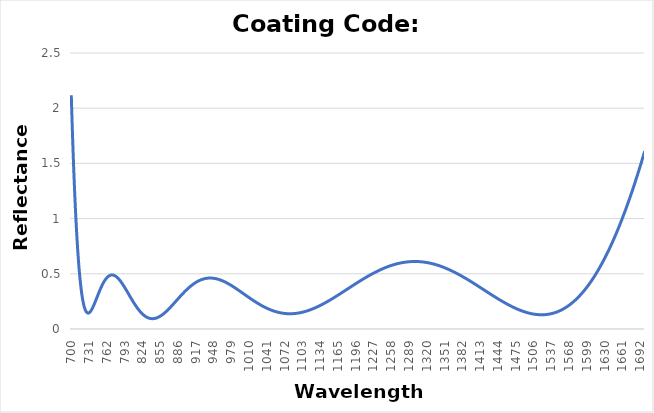
| Category | Reflectance |
|---|---|
| 700.0 | 2.118 |
| 701.0 | 1.944 |
| 702.0 | 1.78 |
| 703.0 | 1.627 |
| 704.0 | 1.484 |
| 705.0 | 1.351 |
| 706.0 | 1.227 |
| 707.0 | 1.111 |
| 708.0 | 1.004 |
| 709.0 | 0.906 |
| 710.0 | 0.815 |
| 711.0 | 0.732 |
| 712.0 | 0.656 |
| 713.0 | 0.586 |
| 714.0 | 0.523 |
| 715.0 | 0.466 |
| 716.0 | 0.415 |
| 717.0 | 0.37 |
| 718.0 | 0.329 |
| 719.0 | 0.293 |
| 720.0 | 0.262 |
| 721.0 | 0.236 |
| 722.0 | 0.213 |
| 723.0 | 0.194 |
| 724.0 | 0.178 |
| 725.0 | 0.166 |
| 726.0 | 0.156 |
| 727.0 | 0.15 |
| 728.0 | 0.146 |
| 729.0 | 0.144 |
| 730.0 | 0.144 |
| 731.0 | 0.146 |
| 732.0 | 0.15 |
| 733.0 | 0.156 |
| 734.0 | 0.162 |
| 735.0 | 0.171 |
| 736.0 | 0.18 |
| 737.0 | 0.19 |
| 738.0 | 0.201 |
| 739.0 | 0.212 |
| 740.0 | 0.224 |
| 741.0 | 0.237 |
| 742.0 | 0.25 |
| 743.0 | 0.263 |
| 744.0 | 0.276 |
| 745.0 | 0.289 |
| 746.0 | 0.302 |
| 747.0 | 0.315 |
| 748.0 | 0.328 |
| 749.0 | 0.341 |
| 750.0 | 0.353 |
| 751.0 | 0.365 |
| 752.0 | 0.377 |
| 753.0 | 0.388 |
| 754.0 | 0.399 |
| 755.0 | 0.409 |
| 756.0 | 0.419 |
| 757.0 | 0.428 |
| 758.0 | 0.436 |
| 759.0 | 0.444 |
| 760.0 | 0.451 |
| 761.0 | 0.458 |
| 762.0 | 0.464 |
| 763.0 | 0.469 |
| 764.0 | 0.474 |
| 765.0 | 0.478 |
| 766.0 | 0.482 |
| 767.0 | 0.484 |
| 768.0 | 0.487 |
| 769.0 | 0.488 |
| 770.0 | 0.489 |
| 771.0 | 0.489 |
| 772.0 | 0.489 |
| 773.0 | 0.488 |
| 774.0 | 0.487 |
| 775.0 | 0.485 |
| 776.0 | 0.482 |
| 777.0 | 0.479 |
| 778.0 | 0.476 |
| 779.0 | 0.472 |
| 780.0 | 0.467 |
| 781.0 | 0.462 |
| 782.0 | 0.457 |
| 783.0 | 0.451 |
| 784.0 | 0.445 |
| 785.0 | 0.439 |
| 786.0 | 0.432 |
| 787.0 | 0.425 |
| 788.0 | 0.418 |
| 789.0 | 0.41 |
| 790.0 | 0.402 |
| 791.0 | 0.394 |
| 792.0 | 0.386 |
| 793.0 | 0.378 |
| 794.0 | 0.369 |
| 795.0 | 0.36 |
| 796.0 | 0.352 |
| 797.0 | 0.343 |
| 798.0 | 0.334 |
| 799.0 | 0.325 |
| 800.0 | 0.316 |
| 801.0 | 0.307 |
| 802.0 | 0.298 |
| 803.0 | 0.29 |
| 804.0 | 0.281 |
| 805.0 | 0.272 |
| 806.0 | 0.263 |
| 807.0 | 0.255 |
| 808.0 | 0.246 |
| 809.0 | 0.238 |
| 810.0 | 0.23 |
| 811.0 | 0.222 |
| 812.0 | 0.214 |
| 813.0 | 0.206 |
| 814.0 | 0.199 |
| 815.0 | 0.192 |
| 816.0 | 0.184 |
| 817.0 | 0.178 |
| 818.0 | 0.171 |
| 819.0 | 0.165 |
| 820.0 | 0.158 |
| 821.0 | 0.153 |
| 822.0 | 0.147 |
| 823.0 | 0.142 |
| 824.0 | 0.137 |
| 825.0 | 0.132 |
| 826.0 | 0.127 |
| 827.0 | 0.123 |
| 828.0 | 0.119 |
| 829.0 | 0.115 |
| 830.0 | 0.112 |
| 831.0 | 0.109 |
| 832.0 | 0.106 |
| 833.0 | 0.104 |
| 834.0 | 0.101 |
| 835.0 | 0.099 |
| 836.0 | 0.098 |
| 837.0 | 0.096 |
| 838.0 | 0.095 |
| 839.0 | 0.094 |
| 840.0 | 0.094 |
| 841.0 | 0.094 |
| 842.0 | 0.094 |
| 843.0 | 0.094 |
| 844.0 | 0.094 |
| 845.0 | 0.095 |
| 846.0 | 0.096 |
| 847.0 | 0.097 |
| 848.0 | 0.099 |
| 849.0 | 0.101 |
| 850.0 | 0.103 |
| 851.0 | 0.105 |
| 852.0 | 0.107 |
| 853.0 | 0.11 |
| 854.0 | 0.113 |
| 855.0 | 0.116 |
| 856.0 | 0.119 |
| 857.0 | 0.123 |
| 858.0 | 0.126 |
| 859.0 | 0.13 |
| 860.0 | 0.134 |
| 861.0 | 0.138 |
| 862.0 | 0.142 |
| 863.0 | 0.147 |
| 864.0 | 0.152 |
| 865.0 | 0.156 |
| 866.0 | 0.161 |
| 867.0 | 0.166 |
| 868.0 | 0.171 |
| 869.0 | 0.176 |
| 870.0 | 0.181 |
| 871.0 | 0.187 |
| 872.0 | 0.192 |
| 873.0 | 0.198 |
| 874.0 | 0.203 |
| 875.0 | 0.209 |
| 876.0 | 0.214 |
| 877.0 | 0.22 |
| 878.0 | 0.226 |
| 879.0 | 0.232 |
| 880.0 | 0.237 |
| 881.0 | 0.243 |
| 882.0 | 0.249 |
| 883.0 | 0.255 |
| 884.0 | 0.261 |
| 885.0 | 0.267 |
| 886.0 | 0.272 |
| 887.0 | 0.278 |
| 888.0 | 0.284 |
| 889.0 | 0.29 |
| 890.0 | 0.295 |
| 891.0 | 0.301 |
| 892.0 | 0.307 |
| 893.0 | 0.312 |
| 894.0 | 0.318 |
| 895.0 | 0.323 |
| 896.0 | 0.329 |
| 897.0 | 0.334 |
| 898.0 | 0.339 |
| 899.0 | 0.344 |
| 900.0 | 0.35 |
| 901.0 | 0.355 |
| 902.0 | 0.36 |
| 903.0 | 0.364 |
| 904.0 | 0.369 |
| 905.0 | 0.374 |
| 906.0 | 0.378 |
| 907.0 | 0.383 |
| 908.0 | 0.387 |
| 909.0 | 0.391 |
| 910.0 | 0.396 |
| 911.0 | 0.4 |
| 912.0 | 0.403 |
| 913.0 | 0.407 |
| 914.0 | 0.411 |
| 915.0 | 0.414 |
| 916.0 | 0.418 |
| 917.0 | 0.421 |
| 918.0 | 0.424 |
| 919.0 | 0.427 |
| 920.0 | 0.43 |
| 921.0 | 0.433 |
| 922.0 | 0.436 |
| 923.0 | 0.438 |
| 924.0 | 0.44 |
| 925.0 | 0.443 |
| 926.0 | 0.445 |
| 927.0 | 0.447 |
| 928.0 | 0.449 |
| 929.0 | 0.451 |
| 930.0 | 0.452 |
| 931.0 | 0.454 |
| 932.0 | 0.455 |
| 933.0 | 0.456 |
| 934.0 | 0.457 |
| 935.0 | 0.458 |
| 936.0 | 0.459 |
| 937.0 | 0.46 |
| 938.0 | 0.46 |
| 939.0 | 0.461 |
| 940.0 | 0.461 |
| 941.0 | 0.461 |
| 942.0 | 0.462 |
| 943.0 | 0.462 |
| 944.0 | 0.461 |
| 945.0 | 0.461 |
| 946.0 | 0.461 |
| 947.0 | 0.46 |
| 948.0 | 0.46 |
| 949.0 | 0.459 |
| 950.0 | 0.458 |
| 951.0 | 0.457 |
| 952.0 | 0.456 |
| 953.0 | 0.455 |
| 954.0 | 0.454 |
| 955.0 | 0.452 |
| 956.0 | 0.451 |
| 957.0 | 0.449 |
| 958.0 | 0.448 |
| 959.0 | 0.446 |
| 960.0 | 0.444 |
| 961.0 | 0.442 |
| 962.0 | 0.44 |
| 963.0 | 0.438 |
| 964.0 | 0.436 |
| 965.0 | 0.433 |
| 966.0 | 0.431 |
| 967.0 | 0.429 |
| 968.0 | 0.426 |
| 969.0 | 0.424 |
| 970.0 | 0.421 |
| 971.0 | 0.418 |
| 972.0 | 0.415 |
| 973.0 | 0.413 |
| 974.0 | 0.41 |
| 975.0 | 0.407 |
| 976.0 | 0.404 |
| 977.0 | 0.401 |
| 978.0 | 0.398 |
| 979.0 | 0.394 |
| 980.0 | 0.391 |
| 981.0 | 0.388 |
| 982.0 | 0.385 |
| 983.0 | 0.381 |
| 984.0 | 0.378 |
| 985.0 | 0.375 |
| 986.0 | 0.371 |
| 987.0 | 0.368 |
| 988.0 | 0.364 |
| 989.0 | 0.361 |
| 990.0 | 0.357 |
| 991.0 | 0.354 |
| 992.0 | 0.35 |
| 993.0 | 0.346 |
| 994.0 | 0.343 |
| 995.0 | 0.339 |
| 996.0 | 0.336 |
| 997.0 | 0.332 |
| 998.0 | 0.328 |
| 999.0 | 0.325 |
| 1000.0 | 0.321 |
| 1001.0 | 0.317 |
| 1002.0 | 0.314 |
| 1003.0 | 0.31 |
| 1004.0 | 0.306 |
| 1005.0 | 0.303 |
| 1006.0 | 0.299 |
| 1007.0 | 0.295 |
| 1008.0 | 0.292 |
| 1009.0 | 0.288 |
| 1010.0 | 0.284 |
| 1011.0 | 0.281 |
| 1012.0 | 0.277 |
| 1013.0 | 0.274 |
| 1014.0 | 0.27 |
| 1015.0 | 0.267 |
| 1016.0 | 0.263 |
| 1017.0 | 0.26 |
| 1018.0 | 0.256 |
| 1019.0 | 0.253 |
| 1020.0 | 0.25 |
| 1021.0 | 0.246 |
| 1022.0 | 0.243 |
| 1023.0 | 0.24 |
| 1024.0 | 0.237 |
| 1025.0 | 0.233 |
| 1026.0 | 0.23 |
| 1027.0 | 0.227 |
| 1028.0 | 0.224 |
| 1029.0 | 0.221 |
| 1030.0 | 0.218 |
| 1031.0 | 0.215 |
| 1032.0 | 0.212 |
| 1033.0 | 0.209 |
| 1034.0 | 0.206 |
| 1035.0 | 0.204 |
| 1036.0 | 0.201 |
| 1037.0 | 0.198 |
| 1038.0 | 0.196 |
| 1039.0 | 0.193 |
| 1040.0 | 0.191 |
| 1041.0 | 0.188 |
| 1042.0 | 0.186 |
| 1043.0 | 0.184 |
| 1044.0 | 0.181 |
| 1045.0 | 0.179 |
| 1046.0 | 0.177 |
| 1047.0 | 0.175 |
| 1048.0 | 0.173 |
| 1049.0 | 0.171 |
| 1050.0 | 0.169 |
| 1051.0 | 0.167 |
| 1052.0 | 0.165 |
| 1053.0 | 0.163 |
| 1054.0 | 0.161 |
| 1055.0 | 0.16 |
| 1056.0 | 0.158 |
| 1057.0 | 0.157 |
| 1058.0 | 0.155 |
| 1059.0 | 0.154 |
| 1060.0 | 0.152 |
| 1061.0 | 0.151 |
| 1062.0 | 0.15 |
| 1063.0 | 0.149 |
| 1064.0 | 0.148 |
| 1065.0 | 0.146 |
| 1066.0 | 0.146 |
| 1067.0 | 0.145 |
| 1068.0 | 0.144 |
| 1069.0 | 0.143 |
| 1070.0 | 0.142 |
| 1071.0 | 0.142 |
| 1072.0 | 0.141 |
| 1073.0 | 0.14 |
| 1074.0 | 0.14 |
| 1075.0 | 0.139 |
| 1076.0 | 0.139 |
| 1077.0 | 0.139 |
| 1078.0 | 0.138 |
| 1079.0 | 0.138 |
| 1080.0 | 0.138 |
| 1081.0 | 0.138 |
| 1082.0 | 0.138 |
| 1083.0 | 0.138 |
| 1084.0 | 0.138 |
| 1085.0 | 0.139 |
| 1086.0 | 0.139 |
| 1087.0 | 0.139 |
| 1088.0 | 0.14 |
| 1089.0 | 0.14 |
| 1090.0 | 0.14 |
| 1091.0 | 0.141 |
| 1092.0 | 0.142 |
| 1093.0 | 0.142 |
| 1094.0 | 0.143 |
| 1095.0 | 0.144 |
| 1096.0 | 0.145 |
| 1097.0 | 0.146 |
| 1098.0 | 0.146 |
| 1099.0 | 0.147 |
| 1100.0 | 0.148 |
| 1101.0 | 0.15 |
| 1102.0 | 0.151 |
| 1103.0 | 0.152 |
| 1104.0 | 0.153 |
| 1105.0 | 0.155 |
| 1106.0 | 0.156 |
| 1107.0 | 0.157 |
| 1108.0 | 0.159 |
| 1109.0 | 0.16 |
| 1110.0 | 0.162 |
| 1111.0 | 0.164 |
| 1112.0 | 0.165 |
| 1113.0 | 0.167 |
| 1114.0 | 0.169 |
| 1115.0 | 0.171 |
| 1116.0 | 0.172 |
| 1117.0 | 0.174 |
| 1118.0 | 0.176 |
| 1119.0 | 0.178 |
| 1120.0 | 0.18 |
| 1121.0 | 0.182 |
| 1122.0 | 0.185 |
| 1123.0 | 0.187 |
| 1124.0 | 0.189 |
| 1125.0 | 0.191 |
| 1126.0 | 0.194 |
| 1127.0 | 0.196 |
| 1128.0 | 0.198 |
| 1129.0 | 0.201 |
| 1130.0 | 0.203 |
| 1131.0 | 0.206 |
| 1132.0 | 0.208 |
| 1133.0 | 0.21 |
| 1134.0 | 0.213 |
| 1135.0 | 0.216 |
| 1136.0 | 0.218 |
| 1137.0 | 0.221 |
| 1138.0 | 0.224 |
| 1139.0 | 0.226 |
| 1140.0 | 0.229 |
| 1141.0 | 0.232 |
| 1142.0 | 0.235 |
| 1143.0 | 0.238 |
| 1144.0 | 0.241 |
| 1145.0 | 0.244 |
| 1146.0 | 0.246 |
| 1147.0 | 0.25 |
| 1148.0 | 0.252 |
| 1149.0 | 0.256 |
| 1150.0 | 0.258 |
| 1151.0 | 0.262 |
| 1152.0 | 0.265 |
| 1153.0 | 0.268 |
| 1154.0 | 0.271 |
| 1155.0 | 0.274 |
| 1156.0 | 0.277 |
| 1157.0 | 0.28 |
| 1158.0 | 0.284 |
| 1159.0 | 0.287 |
| 1160.0 | 0.29 |
| 1161.0 | 0.293 |
| 1162.0 | 0.296 |
| 1163.0 | 0.3 |
| 1164.0 | 0.303 |
| 1165.0 | 0.306 |
| 1166.0 | 0.31 |
| 1167.0 | 0.313 |
| 1168.0 | 0.316 |
| 1169.0 | 0.32 |
| 1170.0 | 0.323 |
| 1171.0 | 0.326 |
| 1172.0 | 0.33 |
| 1173.0 | 0.333 |
| 1174.0 | 0.336 |
| 1175.0 | 0.34 |
| 1176.0 | 0.343 |
| 1177.0 | 0.346 |
| 1178.0 | 0.35 |
| 1179.0 | 0.353 |
| 1180.0 | 0.357 |
| 1181.0 | 0.36 |
| 1182.0 | 0.363 |
| 1183.0 | 0.367 |
| 1184.0 | 0.37 |
| 1185.0 | 0.374 |
| 1186.0 | 0.377 |
| 1187.0 | 0.38 |
| 1188.0 | 0.384 |
| 1189.0 | 0.387 |
| 1190.0 | 0.39 |
| 1191.0 | 0.394 |
| 1192.0 | 0.397 |
| 1193.0 | 0.4 |
| 1194.0 | 0.404 |
| 1195.0 | 0.407 |
| 1196.0 | 0.41 |
| 1197.0 | 0.414 |
| 1198.0 | 0.417 |
| 1199.0 | 0.42 |
| 1200.0 | 0.424 |
| 1201.0 | 0.427 |
| 1202.0 | 0.43 |
| 1203.0 | 0.433 |
| 1204.0 | 0.436 |
| 1205.0 | 0.44 |
| 1206.0 | 0.443 |
| 1207.0 | 0.446 |
| 1208.0 | 0.449 |
| 1209.0 | 0.452 |
| 1210.0 | 0.456 |
| 1211.0 | 0.459 |
| 1212.0 | 0.462 |
| 1213.0 | 0.465 |
| 1214.0 | 0.468 |
| 1215.0 | 0.471 |
| 1216.0 | 0.474 |
| 1217.0 | 0.477 |
| 1218.0 | 0.48 |
| 1219.0 | 0.483 |
| 1220.0 | 0.486 |
| 1221.0 | 0.489 |
| 1222.0 | 0.492 |
| 1223.0 | 0.494 |
| 1224.0 | 0.497 |
| 1225.0 | 0.5 |
| 1226.0 | 0.503 |
| 1227.0 | 0.505 |
| 1228.0 | 0.508 |
| 1229.0 | 0.511 |
| 1230.0 | 0.514 |
| 1231.0 | 0.516 |
| 1232.0 | 0.519 |
| 1233.0 | 0.521 |
| 1234.0 | 0.524 |
| 1235.0 | 0.526 |
| 1236.0 | 0.529 |
| 1237.0 | 0.531 |
| 1238.0 | 0.534 |
| 1239.0 | 0.536 |
| 1240.0 | 0.539 |
| 1241.0 | 0.541 |
| 1242.0 | 0.543 |
| 1243.0 | 0.546 |
| 1244.0 | 0.548 |
| 1245.0 | 0.55 |
| 1246.0 | 0.552 |
| 1247.0 | 0.554 |
| 1248.0 | 0.556 |
| 1249.0 | 0.558 |
| 1250.0 | 0.56 |
| 1251.0 | 0.562 |
| 1252.0 | 0.564 |
| 1253.0 | 0.566 |
| 1254.0 | 0.568 |
| 1255.0 | 0.57 |
| 1256.0 | 0.572 |
| 1257.0 | 0.574 |
| 1258.0 | 0.575 |
| 1259.0 | 0.577 |
| 1260.0 | 0.579 |
| 1261.0 | 0.58 |
| 1262.0 | 0.582 |
| 1263.0 | 0.584 |
| 1264.0 | 0.585 |
| 1265.0 | 0.586 |
| 1266.0 | 0.588 |
| 1267.0 | 0.589 |
| 1268.0 | 0.591 |
| 1269.0 | 0.592 |
| 1270.0 | 0.593 |
| 1271.0 | 0.594 |
| 1272.0 | 0.596 |
| 1273.0 | 0.597 |
| 1274.0 | 0.598 |
| 1275.0 | 0.599 |
| 1276.0 | 0.6 |
| 1277.0 | 0.601 |
| 1278.0 | 0.602 |
| 1279.0 | 0.603 |
| 1280.0 | 0.604 |
| 1281.0 | 0.604 |
| 1282.0 | 0.605 |
| 1283.0 | 0.606 |
| 1284.0 | 0.606 |
| 1285.0 | 0.607 |
| 1286.0 | 0.608 |
| 1287.0 | 0.608 |
| 1288.0 | 0.609 |
| 1289.0 | 0.609 |
| 1290.0 | 0.61 |
| 1291.0 | 0.61 |
| 1292.0 | 0.61 |
| 1293.0 | 0.611 |
| 1294.0 | 0.611 |
| 1295.0 | 0.611 |
| 1296.0 | 0.611 |
| 1297.0 | 0.611 |
| 1298.0 | 0.611 |
| 1299.0 | 0.611 |
| 1300.0 | 0.611 |
| 1301.0 | 0.611 |
| 1302.0 | 0.611 |
| 1303.0 | 0.611 |
| 1304.0 | 0.611 |
| 1305.0 | 0.611 |
| 1306.0 | 0.61 |
| 1307.0 | 0.61 |
| 1308.0 | 0.61 |
| 1309.0 | 0.609 |
| 1310.0 | 0.609 |
| 1311.0 | 0.608 |
| 1312.0 | 0.608 |
| 1313.0 | 0.607 |
| 1314.0 | 0.607 |
| 1315.0 | 0.606 |
| 1316.0 | 0.605 |
| 1317.0 | 0.604 |
| 1318.0 | 0.604 |
| 1319.0 | 0.603 |
| 1320.0 | 0.602 |
| 1321.0 | 0.601 |
| 1322.0 | 0.6 |
| 1323.0 | 0.599 |
| 1324.0 | 0.598 |
| 1325.0 | 0.597 |
| 1326.0 | 0.596 |
| 1327.0 | 0.595 |
| 1328.0 | 0.594 |
| 1329.0 | 0.592 |
| 1330.0 | 0.591 |
| 1331.0 | 0.59 |
| 1332.0 | 0.588 |
| 1333.0 | 0.587 |
| 1334.0 | 0.585 |
| 1335.0 | 0.584 |
| 1336.0 | 0.582 |
| 1337.0 | 0.581 |
| 1338.0 | 0.579 |
| 1339.0 | 0.578 |
| 1340.0 | 0.576 |
| 1341.0 | 0.574 |
| 1342.0 | 0.572 |
| 1343.0 | 0.571 |
| 1344.0 | 0.569 |
| 1345.0 | 0.567 |
| 1346.0 | 0.565 |
| 1347.0 | 0.563 |
| 1348.0 | 0.561 |
| 1349.0 | 0.559 |
| 1350.0 | 0.557 |
| 1351.0 | 0.555 |
| 1352.0 | 0.553 |
| 1353.0 | 0.551 |
| 1354.0 | 0.549 |
| 1355.0 | 0.546 |
| 1356.0 | 0.544 |
| 1357.0 | 0.542 |
| 1358.0 | 0.54 |
| 1359.0 | 0.537 |
| 1360.0 | 0.535 |
| 1361.0 | 0.532 |
| 1362.0 | 0.53 |
| 1363.0 | 0.528 |
| 1364.0 | 0.525 |
| 1365.0 | 0.523 |
| 1366.0 | 0.52 |
| 1367.0 | 0.518 |
| 1368.0 | 0.515 |
| 1369.0 | 0.512 |
| 1370.0 | 0.51 |
| 1371.0 | 0.507 |
| 1372.0 | 0.504 |
| 1373.0 | 0.501 |
| 1374.0 | 0.499 |
| 1375.0 | 0.496 |
| 1376.0 | 0.493 |
| 1377.0 | 0.49 |
| 1378.0 | 0.487 |
| 1379.0 | 0.485 |
| 1380.0 | 0.482 |
| 1381.0 | 0.479 |
| 1382.0 | 0.476 |
| 1383.0 | 0.473 |
| 1384.0 | 0.47 |
| 1385.0 | 0.467 |
| 1386.0 | 0.464 |
| 1387.0 | 0.461 |
| 1388.0 | 0.458 |
| 1389.0 | 0.455 |
| 1390.0 | 0.452 |
| 1391.0 | 0.448 |
| 1392.0 | 0.445 |
| 1393.0 | 0.442 |
| 1394.0 | 0.439 |
| 1395.0 | 0.436 |
| 1396.0 | 0.433 |
| 1397.0 | 0.429 |
| 1398.0 | 0.426 |
| 1399.0 | 0.423 |
| 1400.0 | 0.42 |
| 1401.0 | 0.416 |
| 1402.0 | 0.413 |
| 1403.0 | 0.41 |
| 1404.0 | 0.407 |
| 1405.0 | 0.403 |
| 1406.0 | 0.4 |
| 1407.0 | 0.397 |
| 1408.0 | 0.393 |
| 1409.0 | 0.39 |
| 1410.0 | 0.387 |
| 1411.0 | 0.383 |
| 1412.0 | 0.38 |
| 1413.0 | 0.377 |
| 1414.0 | 0.373 |
| 1415.0 | 0.37 |
| 1416.0 | 0.367 |
| 1417.0 | 0.363 |
| 1418.0 | 0.36 |
| 1419.0 | 0.356 |
| 1420.0 | 0.353 |
| 1421.0 | 0.35 |
| 1422.0 | 0.346 |
| 1423.0 | 0.343 |
| 1424.0 | 0.34 |
| 1425.0 | 0.336 |
| 1426.0 | 0.333 |
| 1427.0 | 0.33 |
| 1428.0 | 0.326 |
| 1429.0 | 0.323 |
| 1430.0 | 0.32 |
| 1431.0 | 0.316 |
| 1432.0 | 0.313 |
| 1433.0 | 0.31 |
| 1434.0 | 0.306 |
| 1435.0 | 0.303 |
| 1436.0 | 0.3 |
| 1437.0 | 0.296 |
| 1438.0 | 0.293 |
| 1439.0 | 0.29 |
| 1440.0 | 0.287 |
| 1441.0 | 0.284 |
| 1442.0 | 0.28 |
| 1443.0 | 0.277 |
| 1444.0 | 0.274 |
| 1445.0 | 0.271 |
| 1446.0 | 0.268 |
| 1447.0 | 0.265 |
| 1448.0 | 0.262 |
| 1449.0 | 0.258 |
| 1450.0 | 0.255 |
| 1451.0 | 0.252 |
| 1452.0 | 0.249 |
| 1453.0 | 0.246 |
| 1454.0 | 0.243 |
| 1455.0 | 0.24 |
| 1456.0 | 0.237 |
| 1457.0 | 0.234 |
| 1458.0 | 0.232 |
| 1459.0 | 0.229 |
| 1460.0 | 0.226 |
| 1461.0 | 0.223 |
| 1462.0 | 0.22 |
| 1463.0 | 0.218 |
| 1464.0 | 0.215 |
| 1465.0 | 0.212 |
| 1466.0 | 0.209 |
| 1467.0 | 0.207 |
| 1468.0 | 0.204 |
| 1469.0 | 0.202 |
| 1470.0 | 0.199 |
| 1471.0 | 0.197 |
| 1472.0 | 0.194 |
| 1473.0 | 0.192 |
| 1474.0 | 0.189 |
| 1475.0 | 0.187 |
| 1476.0 | 0.185 |
| 1477.0 | 0.182 |
| 1478.0 | 0.18 |
| 1479.0 | 0.178 |
| 1480.0 | 0.176 |
| 1481.0 | 0.174 |
| 1482.0 | 0.171 |
| 1483.0 | 0.169 |
| 1484.0 | 0.167 |
| 1485.0 | 0.165 |
| 1486.0 | 0.164 |
| 1487.0 | 0.162 |
| 1488.0 | 0.16 |
| 1489.0 | 0.158 |
| 1490.0 | 0.156 |
| 1491.0 | 0.155 |
| 1492.0 | 0.153 |
| 1493.0 | 0.151 |
| 1494.0 | 0.15 |
| 1495.0 | 0.148 |
| 1496.0 | 0.147 |
| 1497.0 | 0.146 |
| 1498.0 | 0.144 |
| 1499.0 | 0.143 |
| 1500.0 | 0.142 |
| 1501.0 | 0.14 |
| 1502.0 | 0.139 |
| 1503.0 | 0.138 |
| 1504.0 | 0.137 |
| 1505.0 | 0.136 |
| 1506.0 | 0.135 |
| 1507.0 | 0.134 |
| 1508.0 | 0.134 |
| 1509.0 | 0.133 |
| 1510.0 | 0.132 |
| 1511.0 | 0.132 |
| 1512.0 | 0.131 |
| 1513.0 | 0.131 |
| 1514.0 | 0.13 |
| 1515.0 | 0.13 |
| 1516.0 | 0.13 |
| 1517.0 | 0.129 |
| 1518.0 | 0.129 |
| 1519.0 | 0.129 |
| 1520.0 | 0.129 |
| 1521.0 | 0.129 |
| 1522.0 | 0.129 |
| 1523.0 | 0.129 |
| 1524.0 | 0.13 |
| 1525.0 | 0.13 |
| 1526.0 | 0.13 |
| 1527.0 | 0.13 |
| 1528.0 | 0.131 |
| 1529.0 | 0.132 |
| 1530.0 | 0.132 |
| 1531.0 | 0.133 |
| 1532.0 | 0.134 |
| 1533.0 | 0.135 |
| 1534.0 | 0.136 |
| 1535.0 | 0.137 |
| 1536.0 | 0.138 |
| 1537.0 | 0.139 |
| 1538.0 | 0.14 |
| 1539.0 | 0.141 |
| 1540.0 | 0.143 |
| 1541.0 | 0.144 |
| 1542.0 | 0.146 |
| 1543.0 | 0.147 |
| 1544.0 | 0.149 |
| 1545.0 | 0.151 |
| 1546.0 | 0.153 |
| 1547.0 | 0.155 |
| 1548.0 | 0.157 |
| 1549.0 | 0.159 |
| 1550.0 | 0.161 |
| 1551.0 | 0.163 |
| 1552.0 | 0.166 |
| 1553.0 | 0.168 |
| 1554.0 | 0.17 |
| 1555.0 | 0.173 |
| 1556.0 | 0.176 |
| 1557.0 | 0.178 |
| 1558.0 | 0.181 |
| 1559.0 | 0.184 |
| 1560.0 | 0.187 |
| 1561.0 | 0.19 |
| 1562.0 | 0.194 |
| 1563.0 | 0.197 |
| 1564.0 | 0.2 |
| 1565.0 | 0.204 |
| 1566.0 | 0.207 |
| 1567.0 | 0.211 |
| 1568.0 | 0.215 |
| 1569.0 | 0.219 |
| 1570.0 | 0.223 |
| 1571.0 | 0.227 |
| 1572.0 | 0.231 |
| 1573.0 | 0.235 |
| 1574.0 | 0.239 |
| 1575.0 | 0.244 |
| 1576.0 | 0.248 |
| 1577.0 | 0.253 |
| 1578.0 | 0.257 |
| 1579.0 | 0.262 |
| 1580.0 | 0.267 |
| 1581.0 | 0.272 |
| 1582.0 | 0.277 |
| 1583.0 | 0.282 |
| 1584.0 | 0.287 |
| 1585.0 | 0.293 |
| 1586.0 | 0.298 |
| 1587.0 | 0.304 |
| 1588.0 | 0.309 |
| 1589.0 | 0.315 |
| 1590.0 | 0.321 |
| 1591.0 | 0.327 |
| 1592.0 | 0.333 |
| 1593.0 | 0.339 |
| 1594.0 | 0.345 |
| 1595.0 | 0.352 |
| 1596.0 | 0.358 |
| 1597.0 | 0.364 |
| 1598.0 | 0.371 |
| 1599.0 | 0.378 |
| 1600.0 | 0.385 |
| 1601.0 | 0.392 |
| 1602.0 | 0.399 |
| 1603.0 | 0.406 |
| 1604.0 | 0.413 |
| 1605.0 | 0.42 |
| 1606.0 | 0.428 |
| 1607.0 | 0.435 |
| 1608.0 | 0.443 |
| 1609.0 | 0.451 |
| 1610.0 | 0.459 |
| 1611.0 | 0.467 |
| 1612.0 | 0.475 |
| 1613.0 | 0.483 |
| 1614.0 | 0.491 |
| 1615.0 | 0.5 |
| 1616.0 | 0.508 |
| 1617.0 | 0.517 |
| 1618.0 | 0.526 |
| 1619.0 | 0.534 |
| 1620.0 | 0.543 |
| 1621.0 | 0.552 |
| 1622.0 | 0.562 |
| 1623.0 | 0.571 |
| 1624.0 | 0.58 |
| 1625.0 | 0.59 |
| 1626.0 | 0.599 |
| 1627.0 | 0.609 |
| 1628.0 | 0.619 |
| 1629.0 | 0.628 |
| 1630.0 | 0.638 |
| 1631.0 | 0.649 |
| 1632.0 | 0.659 |
| 1633.0 | 0.669 |
| 1634.0 | 0.68 |
| 1635.0 | 0.69 |
| 1636.0 | 0.701 |
| 1637.0 | 0.712 |
| 1638.0 | 0.722 |
| 1639.0 | 0.734 |
| 1640.0 | 0.745 |
| 1641.0 | 0.756 |
| 1642.0 | 0.767 |
| 1643.0 | 0.778 |
| 1644.0 | 0.79 |
| 1645.0 | 0.802 |
| 1646.0 | 0.813 |
| 1647.0 | 0.825 |
| 1648.0 | 0.837 |
| 1649.0 | 0.849 |
| 1650.0 | 0.862 |
| 1651.0 | 0.874 |
| 1652.0 | 0.886 |
| 1653.0 | 0.899 |
| 1654.0 | 0.911 |
| 1655.0 | 0.924 |
| 1656.0 | 0.937 |
| 1657.0 | 0.95 |
| 1658.0 | 0.963 |
| 1659.0 | 0.976 |
| 1660.0 | 0.99 |
| 1661.0 | 1.003 |
| 1662.0 | 1.016 |
| 1663.0 | 1.03 |
| 1664.0 | 1.044 |
| 1665.0 | 1.058 |
| 1666.0 | 1.072 |
| 1667.0 | 1.086 |
| 1668.0 | 1.1 |
| 1669.0 | 1.114 |
| 1670.0 | 1.129 |
| 1671.0 | 1.143 |
| 1672.0 | 1.158 |
| 1673.0 | 1.172 |
| 1674.0 | 1.187 |
| 1675.0 | 1.202 |
| 1676.0 | 1.217 |
| 1677.0 | 1.232 |
| 1678.0 | 1.248 |
| 1679.0 | 1.263 |
| 1680.0 | 1.279 |
| 1681.0 | 1.294 |
| 1682.0 | 1.31 |
| 1683.0 | 1.326 |
| 1684.0 | 1.342 |
| 1685.0 | 1.358 |
| 1686.0 | 1.374 |
| 1687.0 | 1.39 |
| 1688.0 | 1.406 |
| 1689.0 | 1.423 |
| 1690.0 | 1.44 |
| 1691.0 | 1.456 |
| 1692.0 | 1.473 |
| 1693.0 | 1.49 |
| 1694.0 | 1.507 |
| 1695.0 | 1.524 |
| 1696.0 | 1.541 |
| 1697.0 | 1.559 |
| 1698.0 | 1.576 |
| 1699.0 | 1.594 |
| 1700.0 | 1.611 |